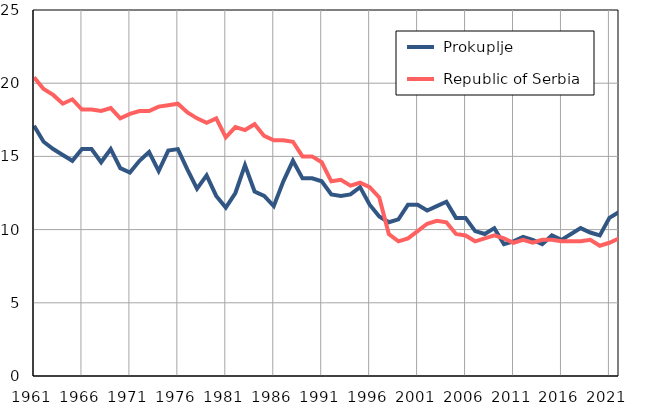
| Category |  Prokuplje |  Republic of Serbia |
|---|---|---|
| 1961.0 | 17.1 | 20.4 |
| 1962.0 | 16 | 19.6 |
| 1963.0 | 15.5 | 19.2 |
| 1964.0 | 15.1 | 18.6 |
| 1965.0 | 14.7 | 18.9 |
| 1966.0 | 15.5 | 18.2 |
| 1967.0 | 15.5 | 18.2 |
| 1968.0 | 14.6 | 18.1 |
| 1969.0 | 15.5 | 18.3 |
| 1970.0 | 14.2 | 17.6 |
| 1971.0 | 13.9 | 17.9 |
| 1972.0 | 14.7 | 18.1 |
| 1973.0 | 15.3 | 18.1 |
| 1974.0 | 14 | 18.4 |
| 1975.0 | 15.4 | 18.5 |
| 1976.0 | 15.5 | 18.6 |
| 1977.0 | 14.1 | 18 |
| 1978.0 | 12.8 | 17.6 |
| 1979.0 | 13.7 | 17.3 |
| 1980.0 | 12.3 | 17.6 |
| 1981.0 | 11.5 | 16.3 |
| 1982.0 | 12.5 | 17 |
| 1983.0 | 14.4 | 16.8 |
| 1984.0 | 12.6 | 17.2 |
| 1985.0 | 12.3 | 16.4 |
| 1986.0 | 11.6 | 16.1 |
| 1987.0 | 13.3 | 16.1 |
| 1988.0 | 14.7 | 16 |
| 1989.0 | 13.5 | 15 |
| 1990.0 | 13.5 | 15 |
| 1991.0 | 13.3 | 14.6 |
| 1992.0 | 12.4 | 13.3 |
| 1993.0 | 12.3 | 13.4 |
| 1994.0 | 12.4 | 13 |
| 1995.0 | 12.9 | 13.2 |
| 1996.0 | 11.7 | 12.9 |
| 1997.0 | 10.9 | 12.2 |
| 1998.0 | 10.5 | 9.7 |
| 1999.0 | 10.7 | 9.2 |
| 2000.0 | 11.7 | 9.4 |
| 2001.0 | 11.7 | 9.9 |
| 2002.0 | 11.3 | 10.4 |
| 2003.0 | 11.6 | 10.6 |
| 2004.0 | 11.9 | 10.5 |
| 2005.0 | 10.8 | 9.7 |
| 2006.0 | 10.8 | 9.6 |
| 2007.0 | 9.9 | 9.2 |
| 2008.0 | 9.7 | 9.4 |
| 2009.0 | 10.1 | 9.6 |
| 2010.0 | 9 | 9.4 |
| 2011.0 | 9.2 | 9.1 |
| 2012.0 | 9.5 | 9.3 |
| 2013.0 | 9.3 | 9.1 |
| 2014.0 | 9 | 9.3 |
| 2015.0 | 9.6 | 9.3 |
| 2016.0 | 9.3 | 9.2 |
| 2017.0 | 9.7 | 9.2 |
| 2018.0 | 10.1 | 9.2 |
| 2019.0 | 9.8 | 9.3 |
| 2020.0 | 9.6 | 8.9 |
| 2021.0 | 10.8 | 9.1 |
| 2022.0 | 11.2 | 9.4 |